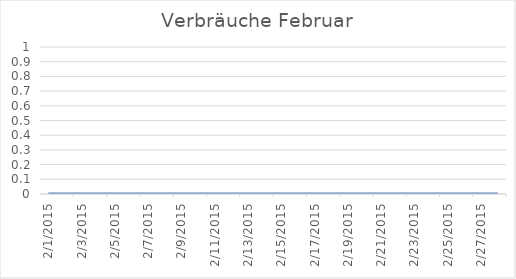
| Category | Series 0 |
|---|---|
| 01/02/2015 | 0 |
| 02/02/2015 | 0 |
| 03/02/2015 | 0 |
| 04/02/2015 | 0 |
| 05/02/2015 | 0 |
| 06/02/2015 | 0 |
| 07/02/2015 | 0 |
| 08/02/2015 | 0 |
| 09/02/2015 | 0 |
| 10/02/2015 | 0 |
| 11/02/2015 | 0 |
| 12/02/2015 | 0 |
| 13/02/2015 | 0 |
| 14/02/2015 | 0 |
| 15/02/2015 | 0 |
| 16/02/2015 | 0 |
| 17/02/2015 | 0 |
| 18/02/2015 | 0 |
| 19/02/2015 | 0 |
| 20/02/2015 | 0 |
| 21/02/2015 | 0 |
| 22/02/2015 | 0 |
| 23/02/2015 | 0 |
| 24/02/2015 | 0 |
| 25/02/2015 | 0 |
| 26/02/2015 | 0 |
| 27/02/2015 | 0 |
| 28/02/2015 | 0 |